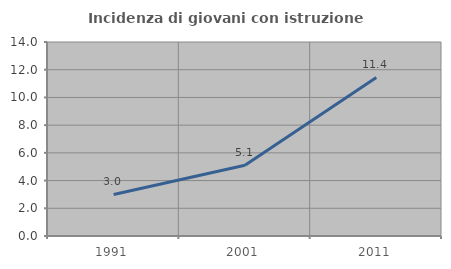
| Category | Incidenza di giovani con istruzione universitaria |
|---|---|
| 1991.0 | 3 |
| 2001.0 | 5.109 |
| 2011.0 | 11.446 |